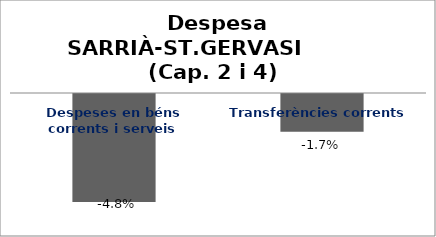
| Category | Series 0 |
|---|---|
| Despeses en béns corrents i serveis | -0.048 |
| Transferències corrents | -0.017 |